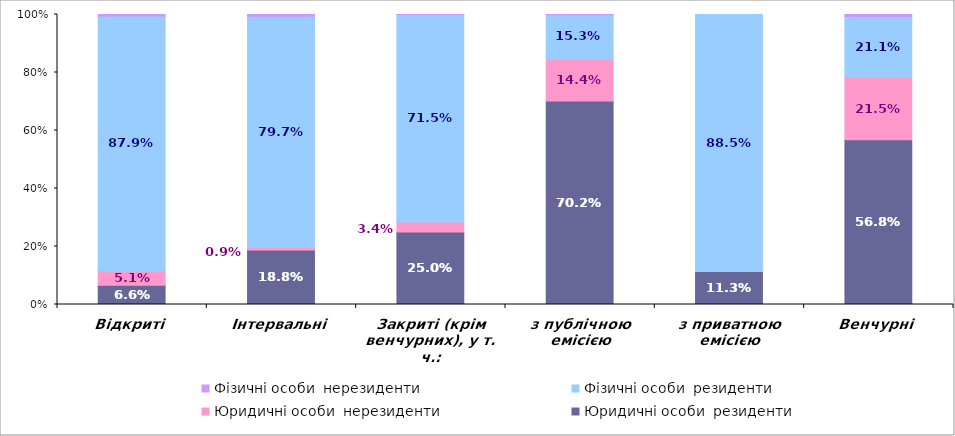
| Category | Юридичні особи  | Фізичні особи  |
|---|---|---|
| Відкриті | 0.051 | 0.005 |
| Інтервальні | 0.009 | 0.006 |
| Закриті (крім венчурних), у т. ч.: | 0.034 | 0 |
| з публічною емісією | 0.144 | 0.001 |
| з приватною емісією | 0.002 | 0 |
| Венчурні | 0.215 | 0.006 |